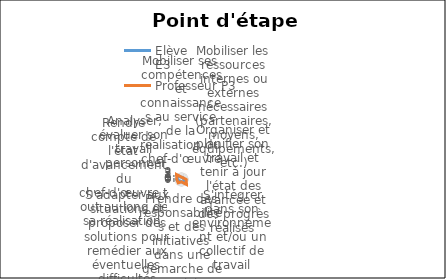
| Category | Elève 
E3 | Professeur P3 |
|---|---|---|
| Mobiliser ses compétences et connaissances au service de la réalisation du chef-d'œuvre | 1 | 1 |
| Mobiliser les ressources internes ou externes nécessaires (partenaires, moyens, équipements, etc.) | 1 | 1 |
| Organiser et planifier son travail et tenir à jour l'état des avancée et des progrès réalisés | 1 | 2 |
| S'intégrer dans son environnement et/ou un collectif de travail | 2 | 3 |
| Prendre des responsabilités et des initiatives dans une démarche de projet | 1 | 1 |
| S'adapter aux situations et proposer des solutions pour remédier aux éventuelles difficultés rencontrées | 1 | 2 |
| Rendre compte de l'état d'avancement du chef-d'œuvre tout au long de sa réalisation | 2 | 2 |
| Analyser, évaluer son travail personnel | 2 | 3 |